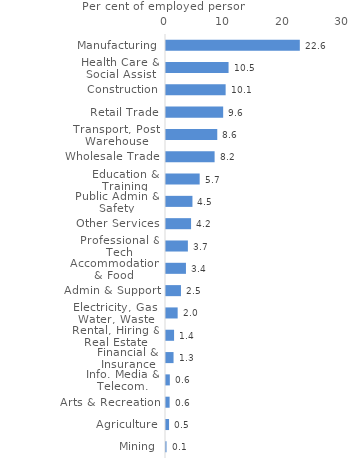
| Category | Series 0 |
|---|---|
| Manufacturing | 22.553 |
| Health Care & Social Assist | 10.543 |
| Construction | 10.052 |
| Retail Trade | 9.635 |
| Transport, Post, Warehouse | 8.64 |
| Wholesale Trade | 8.191 |
| Education & Training | 5.675 |
| Public Admin & Safety | 4.459 |
| Other Services | 4.224 |
| Professional & Tech | 3.688 |
| Accommodation & Food | 3.363 |
| Admin & Support | 2.522 |
| Electricity, Gas, Water, Waste | 1.965 |
| Rental, Hiring & Real Estate | 1.361 |
| Financial & Insurance | 1.271 |
| Info. Media & Telecom. | 0.646 |
| Arts & Recreation | 0.61 |
| Agriculture | 0.514 |
| Mining | 0.088 |